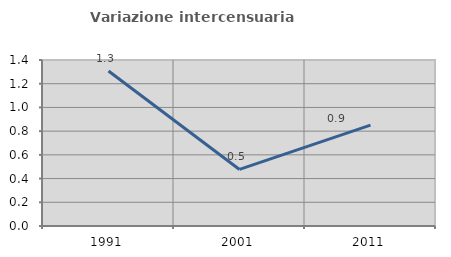
| Category | Variazione intercensuaria annua |
|---|---|
| 1991.0 | 1.308 |
| 2001.0 | 0.477 |
| 2011.0 | 0.85 |